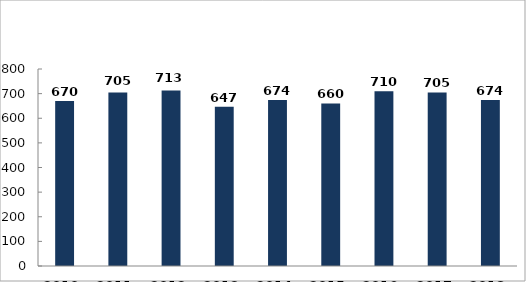
| Category | Személysérüléses közúti közlekedési baleset során meghalt, illetve megsérült személyek száma (fő) |
|---|---|
| 2010. év | 670 |
| 2011. év | 705 |
| 2012. év | 713 |
| 2013. év | 647 |
| 2014. év | 674 |
| 2015. év | 660 |
| 2016. év | 710 |
| 2017. év | 705 |
| 2018. év | 674 |